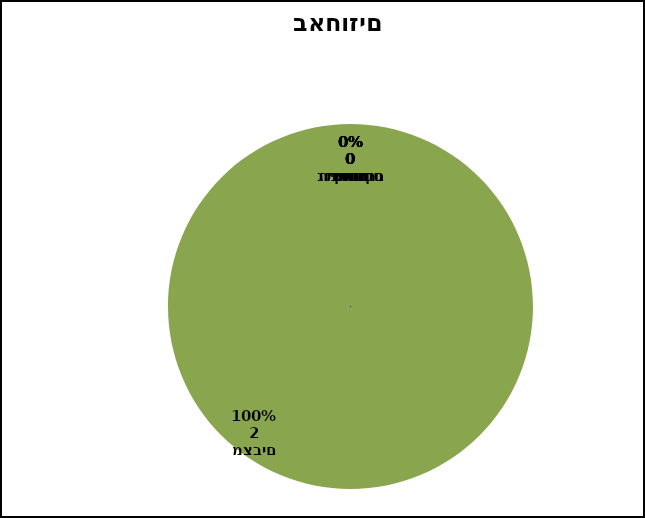
| Category | Series 0 |
|---|---|
| צירים | 0 |
| גוף חימום | 0 |
| בורר מצבים | 2 |
| תרמוסטט בטחון | 0 |
| תרמוסטט | 0 |
| מאוורר | 0 |
| חיווט | 0 |